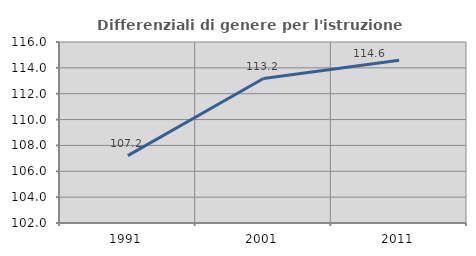
| Category | Differenziali di genere per l'istruzione superiore |
|---|---|
| 1991.0 | 107.207 |
| 2001.0 | 113.174 |
| 2011.0 | 114.589 |